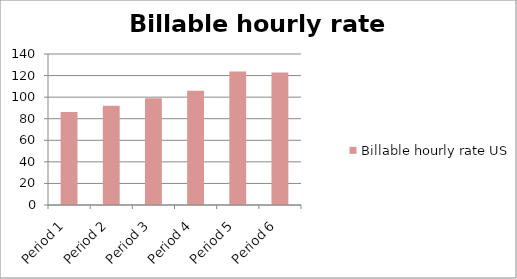
| Category | Billable hourly rate USD |
|---|---|
| Period 1 | 86.333 |
| Period 2 | 91.975 |
| Period 3 | 98.87 |
| Period 4 | 106.038 |
| Period 5 | 123.723 |
| Period 6 | 122.854 |